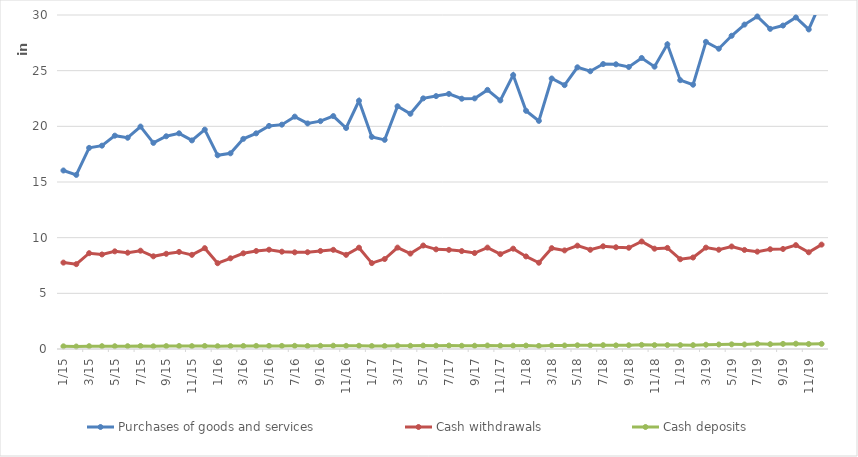
| Category | Purchases of goods and services | Cash withdrawals | Cash deposits |
|---|---|---|---|
| 2015-01-01 | 16033872 | 7760139 | 239587 |
| 2015-02-01 | 15637641 | 7620981 | 222990 |
| 2015-03-01 | 18065168 | 8604490 | 253483 |
| 2015-04-01 | 18264523 | 8492174 | 253670 |
| 2015-05-01 | 19161347 | 8771142 | 248804 |
| 2015-06-01 | 18974934 | 8650546 | 251752 |
| 2015-07-01 | 19978753 | 8829062 | 268973 |
| 2015-08-01 | 18513003 | 8324437 | 242704 |
| 2015-09-01 | 19107101 | 8550717 | 261085 |
| 2015-10-01 | 19371983 | 8721223 | 267668 |
| 2015-11-01 | 18735336 | 8457174 | 258968 |
| 2015-12-01 | 19702648 | 9057084 | 270418 |
| 2016-01-01 | 17398064 | 7705887 | 250979 |
| 2016-02-01 | 17577786 | 8146928 | 259555 |
| 2016-03-01 | 18875299 | 8593920 | 272696 |
| 2016-04-01 | 19369964 | 8804418 | 277496 |
| 2016-05-01 | 20037862 | 8919523 | 278601 |
| 2016-06-01 | 20150390 | 8741649 | 277426 |
| 2016-07-01 | 20870879 | 8683541 | 283583 |
| 2016-08-01 | 20259924 | 8691419 | 271392 |
| 2016-09-01 | 20465635 | 8807988 | 288102 |
| 2016-10-01 | 20920878 | 8907964 | 295858 |
| 2016-11-01 | 19849686 | 8457454 | 283318 |
| 2016-12-01 | 22297704 | 9100521 | 288992 |
| 2017-01-01 | 19049740 | 7716439 | 265475 |
| 2017-02-01 | 18785910 | 8081647 | 265311 |
| 2017-03-01 | 21801248 | 9107151 | 302879 |
| 2017-04-01 | 21129812 | 8571202 | 288079 |
| 2017-05-01 | 22511452 | 9294160 | 306151 |
| 2017-06-01 | 22715590 | 8951156 | 296174 |
| 2017-07-01 | 22914007 | 8905597 | 308473 |
| 2017-08-01 | 22481726 | 8794295 | 287793 |
| 2017-09-01 | 22509349 | 8620457 | 292598 |
| 2017-10-01 | 23273782 | 9107770 | 314282 |
| 2017-11-01 | 22326676 | 8521273 | 297593 |
| 2017-12-01 | 24603928 | 9011798 | 298450 |
| 2018-01-01 | 21396290 | 8314259 | 305732 |
| 2018-02-01 | 20491901 | 7749190 | 278411 |
| 2018-03-01 | 24296065 | 9056018 | 316824 |
| 2018-04-01 | 23700086 | 8856107 | 314520 |
| 2018-05-01 | 25302064 | 9282489 | 334814 |
| 2018-06-01 | 24948705 | 8910680 | 327731 |
| 2018-07-01 | 25594455 | 9224908 | 345087 |
| 2018-08-01 | 25571707 | 9136840 | 326566 |
| 2018-09-01 | 25329990 | 9093823 | 337978 |
| 2018-10-01 | 26139693 | 9657377 | 370965 |
| 2018-11-01 | 25358722 | 9011008 | 349382 |
| 2018-12-01 | 27366263 | 9079602 | 351122 |
| 2019-01-01 | 24146356 | 8064158 | 350414 |
| 2019-02-01 | 23738333 | 8215912 | 346721 |
| 2019-03-01 | 27590008 | 9105578 | 381640 |
| 2019-04-01 | 26971169 | 8915705 | 404555 |
| 2019-05-01 | 28133460 | 9207026 | 418371 |
| 2019-06-01 | 29138551 | 8897073 | 406867 |
| 2019-07-01 | 29867201 | 8744389 | 467229 |
| 2019-08-01 | 28755040 | 8960968 | 432139 |
| 2019-09-01 | 29050955 | 8985078 | 458365 |
| 2019-10-01 | 29778371 | 9328480 | 476692 |
| 2019-11-01 | 28702400 | 8686035 | 449473 |
| 2019-12-01 | 31322325 | 9376124 | 460961 |